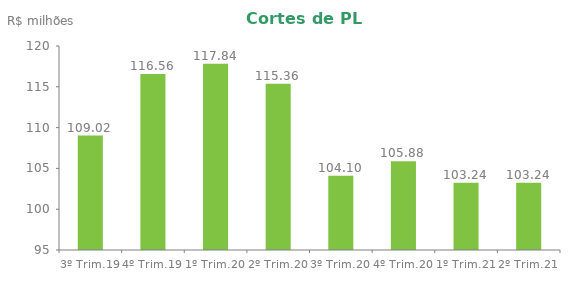
| Category | Series 0 |
|---|---|
| 3º Trim.19 | 109.023 |
| 4º Trim.19 | 116.56 |
| 1º Trim.20 | 117.839 |
| 2º Trim.20 | 115.362 |
| 3º Trim.20 | 104.099 |
| 4º Trim.20 | 105.884 |
| 1º Trim.21 | 103.241 |
| 2º Trim.21 | 103.241 |